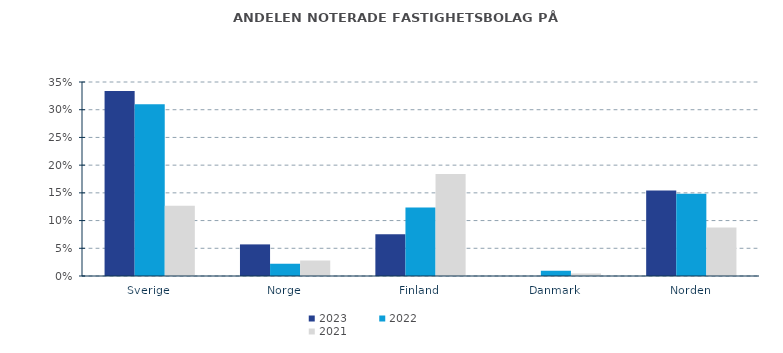
| Category | 2023 | 2022 | 2021 |
|---|---|---|---|
| Sverige | 0.334 | 0.31 | 0.127 |
| Norge | 0.057 | 0.022 | 0.028 |
| Finland | 0.075 | 0.124 | 0.184 |
| Danmark | 0 | 0.009 | 0.005 |
| Norden | 0.154 | 0.148 | 0.087 |